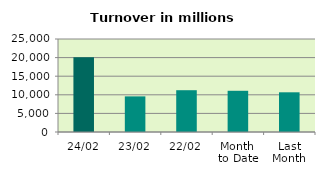
| Category | Series 0 |
|---|---|
| 24/02 | 20077.912 |
| 23/02 | 9574.136 |
| 22/02 | 11234.982 |
| Month 
to Date | 11078.451 |
| Last
Month | 10672.471 |